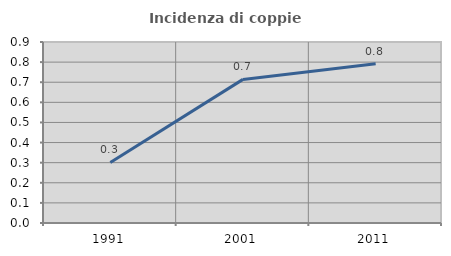
| Category | Incidenza di coppie miste |
|---|---|
| 1991.0 | 0.301 |
| 2001.0 | 0.714 |
| 2011.0 | 0.792 |